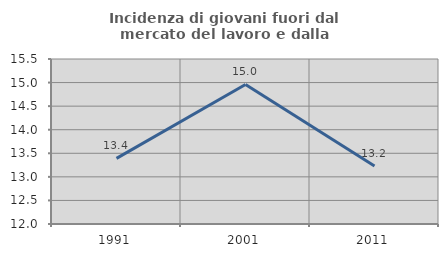
| Category | Incidenza di giovani fuori dal mercato del lavoro e dalla formazione  |
|---|---|
| 1991.0 | 13.393 |
| 2001.0 | 14.961 |
| 2011.0 | 13.229 |